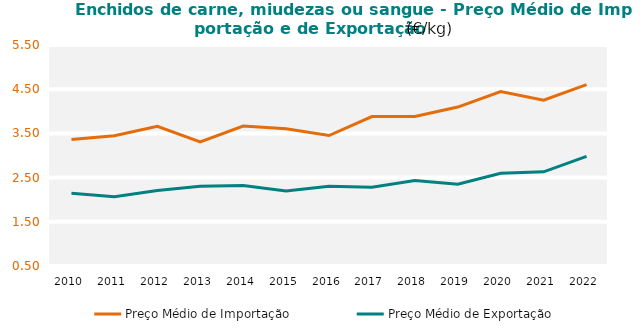
| Category | Preço Médio de Importação | Preço Médio de Exportação |
|---|---|---|
| 2010.0 | 3.361 | 2.144 |
| 2011.0 | 3.447 | 2.069 |
| 2012.0 | 3.659 | 2.207 |
| 2013.0 | 3.307 | 2.303 |
| 2014.0 | 3.665 | 2.319 |
| 2015.0 | 3.605 | 2.197 |
| 2016.0 | 3.451 | 2.306 |
| 2017.0 | 3.881 | 2.28 |
| 2018.0 | 3.884 | 2.435 |
| 2019.0 | 4.096 | 2.351 |
| 2020.0 | 4.448 | 2.596 |
| 2021.0 | 4.25 | 2.631 |
| 2022.0 | 4.604 | 2.98 |